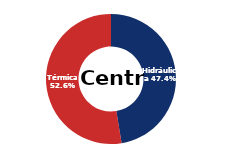
| Category | Centro |
|---|---|
| Eólica | 0 |
| Hidráulica | 1823.535 |
| Solar | 0.006 |
| Térmica | 2024.021 |